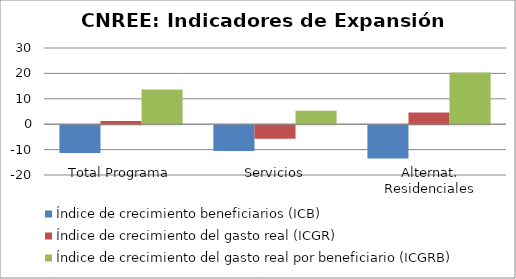
| Category | Índice de crecimiento beneficiarios (ICB)  | Índice de crecimiento del gasto real (ICGR)  | Índice de crecimiento del gasto real por beneficiario (ICGRB)  |
|---|---|---|---|
| Total Programa | -10.967 | 1.221 | 13.689 |
| Servicios | -10.169 | -5.371 | 5.341 |
| Alternat. Residenciales | -13.067 | 4.605 | 20.329 |